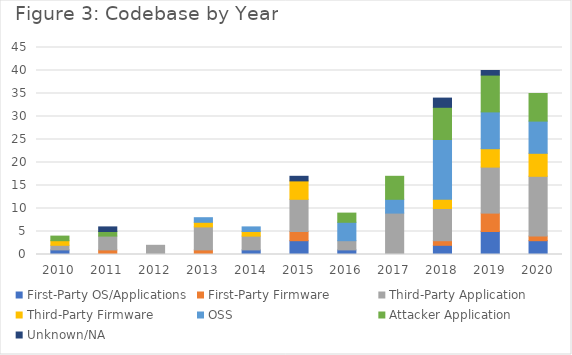
| Category | First-Party OS/Applications | First-Party Firmware | Third-Party Application | Third-Party Firmware | OSS | Attacker Application | Unknown/NA |
|---|---|---|---|---|---|---|---|
| 2010.0 | 1 | 0 | 1 | 1 | 0 | 1 | 0 |
| 2011.0 | 0 | 1 | 3 | 0 | 0 | 1 | 1 |
| 2012.0 | 0 | 0 | 2 | 0 | 0 | 0 | 0 |
| 2013.0 | 0 | 1 | 5 | 1 | 1 | 0 | 0 |
| 2014.0 | 1 | 0 | 3 | 1 | 1 | 0 | 0 |
| 2015.0 | 3 | 2 | 7 | 4 | 0 | 0 | 1 |
| 2016.0 | 1 | 0 | 2 | 0 | 4 | 2 | 0 |
| 2017.0 | 0 | 0 | 9 | 0 | 3 | 5 | 0 |
| 2018.0 | 2 | 1 | 7 | 2 | 13 | 7 | 2 |
| 2019.0 | 5 | 4 | 10 | 4 | 8 | 8 | 1 |
| 2020.0 | 3 | 1 | 13 | 5 | 7 | 6 | 0 |